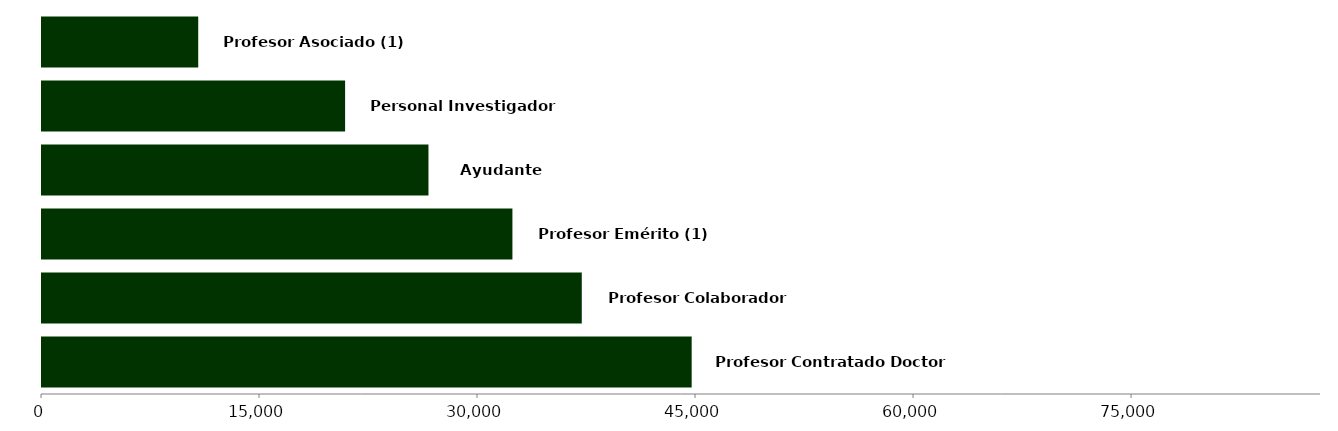
| Category | Series 3 |
|---|---|
| Profesor Contratado Doctor | 44700.233 |
| Profesor Colaborador | 37138.556 |
| Profesor Emérito (1) | 32366.727 |
| Ayudante | 26590.485 |
| Personal Investigador | 20854.139 |
| Profesor Asociado (1) | 10749.175 |